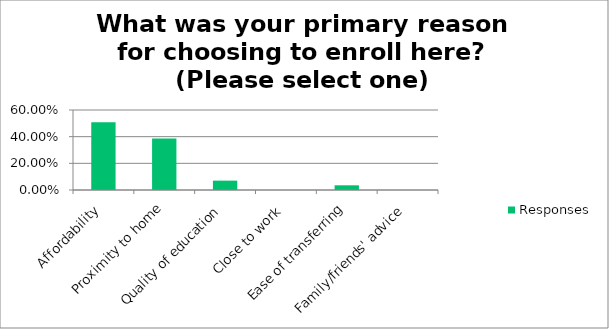
| Category | Responses |
|---|---|
| Affordability | 0.509 |
| Proximity to home | 0.386 |
| Quality of education | 0.07 |
| Close to work | 0 |
| Ease of transferring | 0.035 |
| Family/friends' advice | 0 |